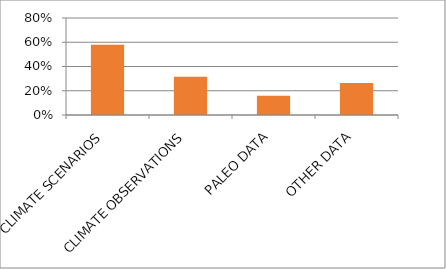
| Category | Series 0 |
|---|---|
| CLIMATE SCENARIOS | 0.579 |
| CLIMATE OBSERVATIONS | 0.316 |
| PALEO DATA | 0.158 |
| OTHER DATA | 0.263 |